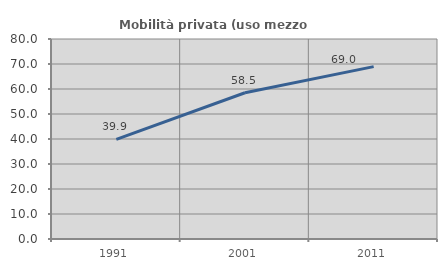
| Category | Mobilità privata (uso mezzo privato) |
|---|---|
| 1991.0 | 39.859 |
| 2001.0 | 58.488 |
| 2011.0 | 68.953 |